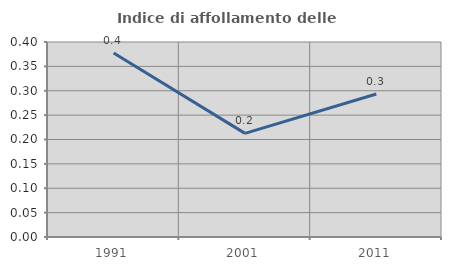
| Category | Indice di affollamento delle abitazioni  |
|---|---|
| 1991.0 | 0.378 |
| 2001.0 | 0.213 |
| 2011.0 | 0.293 |